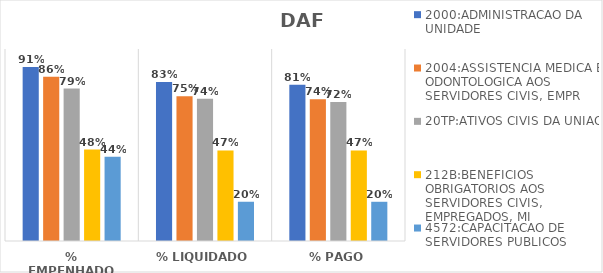
| Category | 2000:ADMINISTRACAO DA UNIDADE | 2004:ASSISTENCIA MEDICA E ODONTOLOGICA AOS SERVIDORES CIVIS, EMPR | 20TP:ATIVOS CIVIS DA UNIAO | 212B:BENEFICIOS OBRIGATORIOS AOS SERVIDORES CIVIS, EMPREGADOS, MI | 4572:CAPACITACAO DE SERVIDORES PUBLICOS FEDERAIS EM PROCESSO DE Q |
|---|---|---|---|---|---|
| % EMPENHADO | 0.906 | 0.856 | 0.794 | 0.476 | 0.438 |
| % LIQUIDADO | 0.828 | 0.754 | 0.741 | 0.472 | 0.204 |
| % PAGO | 0.814 | 0.739 | 0.723 | 0.471 | 0.204 |